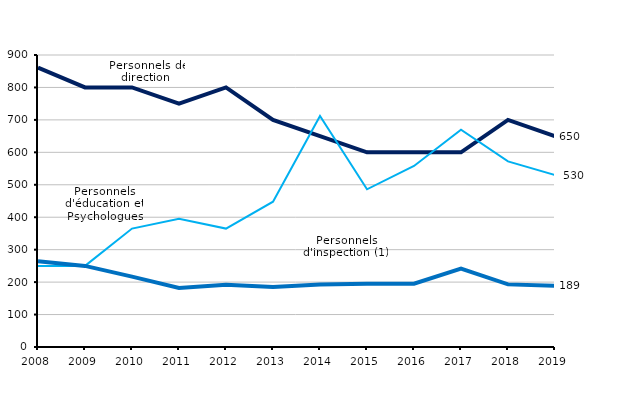
| Category | Personnels de direction  | Personnels d'éducation et psychologues | Personnels d'inspection (1) |
|---|---|---|---|
| 2008.0 | 861 | 250 | 264 |
| 2009.0 | 800 | 250 | 250 |
| 2010.0 | 800 | 365 | 217 |
| 2011.0 | 750 | 395 | 182 |
| 2012.0 | 800 | 365 | 192 |
| 2013.0 | 700 | 448 | 185 |
| 2014.0 | 650 | 712 | 193 |
| 2015.0 | 600 | 486 | 195 |
| 2016.0 | 600 | 558 | 195 |
| 2017.0 | 600 | 670 | 242 |
| 2018.0 | 700 | 572 | 193 |
| 2019.0 | 650 | 530 | 189 |